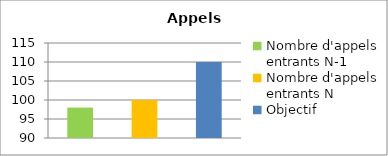
| Category | Series 0 |
|---|---|
| Nombre d'appels entrants N-1 | 98 |
| Nombre d'appels entrants N | 100 |
| Objectif | 110 |